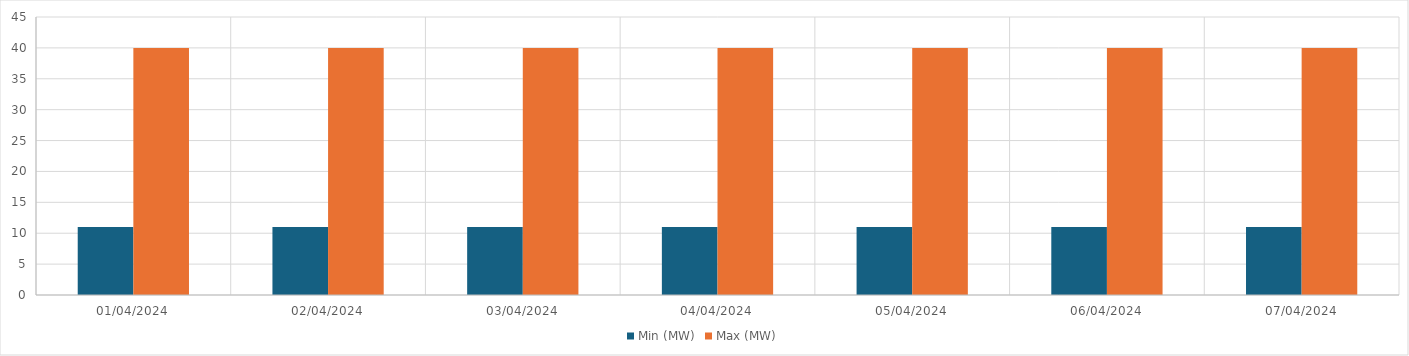
| Category | Min (MW) | Max (MW) |
|---|---|---|
| 01/04/2024 | 11 | 40 |
| 02/04/2024 | 11 | 40 |
| 03/04/2024 | 11 | 40 |
| 04/04/2024 | 11 | 40 |
| 05/04/2024 | 11 | 40 |
| 06/04/2024 | 11 | 40 |
| 07/04/2024 | 11 | 40 |